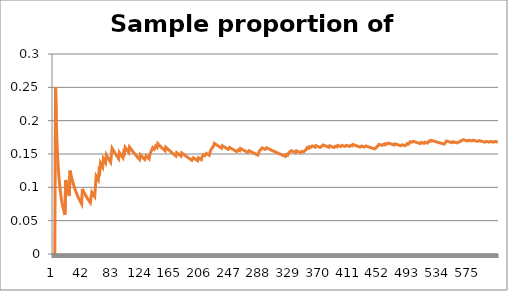
| Category | Series 1 |
|---|---|
| 0 | 0 |
| 1 | 0 |
| 2 | 0 |
| 3 | 0.25 |
| 4 | 0.2 |
| 5 | 0.167 |
| 6 | 0.143 |
| 7 | 0.125 |
| 8 | 0.111 |
| 9 | 0.1 |
| 10 | 0.091 |
| 11 | 0.083 |
| 12 | 0.077 |
| 13 | 0.071 |
| 14 | 0.067 |
| 15 | 0.062 |
| 16 | 0.059 |
| 17 | 0.111 |
| 18 | 0.105 |
| 19 | 0.1 |
| 20 | 0.095 |
| 21 | 0.091 |
| 22 | 0.087 |
| 23 | 0.125 |
| 24 | 0.12 |
| 25 | 0.115 |
| 26 | 0.111 |
| 27 | 0.107 |
| 28 | 0.103 |
| 29 | 0.1 |
| 30 | 0.097 |
| 31 | 0.094 |
| 32 | 0.091 |
| 33 | 0.088 |
| 34 | 0.086 |
| 35 | 0.083 |
| 36 | 0.081 |
| 37 | 0.079 |
| 38 | 0.077 |
| 39 | 0.075 |
| 40 | 0.098 |
| 41 | 0.095 |
| 42 | 0.093 |
| 43 | 0.091 |
| 44 | 0.089 |
| 45 | 0.087 |
| 46 | 0.085 |
| 47 | 0.083 |
| 48 | 0.082 |
| 49 | 0.08 |
| 50 | 0.078 |
| 51 | 0.077 |
| 52 | 0.075 |
| 53 | 0.093 |
| 54 | 0.091 |
| 55 | 0.089 |
| 56 | 0.088 |
| 57 | 0.086 |
| 58 | 0.102 |
| 59 | 0.117 |
| 60 | 0.115 |
| 61 | 0.113 |
| 62 | 0.111 |
| 63 | 0.125 |
| 64 | 0.123 |
| 65 | 0.136 |
| 66 | 0.134 |
| 67 | 0.132 |
| 68 | 0.13 |
| 69 | 0.143 |
| 70 | 0.141 |
| 71 | 0.139 |
| 72 | 0.137 |
| 73 | 0.149 |
| 74 | 0.147 |
| 75 | 0.145 |
| 76 | 0.143 |
| 77 | 0.141 |
| 78 | 0.139 |
| 79 | 0.138 |
| 80 | 0.148 |
| 81 | 0.159 |
| 82 | 0.157 |
| 83 | 0.155 |
| 84 | 0.153 |
| 85 | 0.151 |
| 86 | 0.149 |
| 87 | 0.148 |
| 88 | 0.146 |
| 89 | 0.144 |
| 90 | 0.143 |
| 91 | 0.152 |
| 92 | 0.151 |
| 93 | 0.149 |
| 94 | 0.147 |
| 95 | 0.146 |
| 96 | 0.144 |
| 97 | 0.153 |
| 98 | 0.152 |
| 99 | 0.16 |
| 100 | 0.158 |
| 101 | 0.157 |
| 102 | 0.155 |
| 103 | 0.154 |
| 104 | 0.152 |
| 105 | 0.16 |
| 106 | 0.159 |
| 107 | 0.157 |
| 108 | 0.156 |
| 109 | 0.155 |
| 110 | 0.153 |
| 111 | 0.152 |
| 112 | 0.15 |
| 113 | 0.149 |
| 114 | 0.148 |
| 115 | 0.147 |
| 116 | 0.145 |
| 117 | 0.144 |
| 118 | 0.143 |
| 119 | 0.142 |
| 120 | 0.149 |
| 121 | 0.148 |
| 122 | 0.146 |
| 123 | 0.145 |
| 124 | 0.144 |
| 125 | 0.143 |
| 126 | 0.142 |
| 127 | 0.141 |
| 128 | 0.147 |
| 129 | 0.146 |
| 130 | 0.145 |
| 131 | 0.144 |
| 132 | 0.143 |
| 133 | 0.149 |
| 134 | 0.148 |
| 135 | 0.154 |
| 136 | 0.153 |
| 137 | 0.159 |
| 138 | 0.158 |
| 139 | 0.157 |
| 140 | 0.156 |
| 141 | 0.162 |
| 142 | 0.161 |
| 143 | 0.16 |
| 144 | 0.166 |
| 145 | 0.164 |
| 146 | 0.163 |
| 147 | 0.162 |
| 148 | 0.161 |
| 149 | 0.16 |
| 150 | 0.159 |
| 151 | 0.158 |
| 152 | 0.157 |
| 153 | 0.156 |
| 154 | 0.155 |
| 155 | 0.16 |
| 156 | 0.159 |
| 157 | 0.158 |
| 158 | 0.157 |
| 159 | 0.156 |
| 160 | 0.155 |
| 161 | 0.154 |
| 162 | 0.153 |
| 163 | 0.152 |
| 164 | 0.152 |
| 165 | 0.151 |
| 166 | 0.15 |
| 167 | 0.149 |
| 168 | 0.148 |
| 169 | 0.147 |
| 170 | 0.152 |
| 171 | 0.151 |
| 172 | 0.15 |
| 173 | 0.149 |
| 174 | 0.149 |
| 175 | 0.148 |
| 176 | 0.147 |
| 177 | 0.152 |
| 178 | 0.151 |
| 179 | 0.15 |
| 180 | 0.149 |
| 181 | 0.148 |
| 182 | 0.148 |
| 183 | 0.147 |
| 184 | 0.146 |
| 185 | 0.145 |
| 186 | 0.144 |
| 187 | 0.144 |
| 188 | 0.143 |
| 189 | 0.142 |
| 190 | 0.141 |
| 191 | 0.141 |
| 192 | 0.14 |
| 193 | 0.144 |
| 194 | 0.144 |
| 195 | 0.143 |
| 196 | 0.142 |
| 197 | 0.141 |
| 198 | 0.141 |
| 199 | 0.14 |
| 200 | 0.144 |
| 201 | 0.144 |
| 202 | 0.143 |
| 203 | 0.142 |
| 204 | 0.141 |
| 205 | 0.146 |
| 206 | 0.145 |
| 207 | 0.149 |
| 208 | 0.148 |
| 209 | 0.148 |
| 210 | 0.147 |
| 211 | 0.151 |
| 212 | 0.15 |
| 213 | 0.15 |
| 214 | 0.149 |
| 215 | 0.148 |
| 216 | 0.152 |
| 217 | 0.156 |
| 218 | 0.155 |
| 219 | 0.159 |
| 220 | 0.158 |
| 221 | 0.162 |
| 222 | 0.166 |
| 223 | 0.165 |
| 224 | 0.164 |
| 225 | 0.164 |
| 226 | 0.163 |
| 227 | 0.162 |
| 228 | 0.162 |
| 229 | 0.161 |
| 230 | 0.16 |
| 231 | 0.159 |
| 232 | 0.159 |
| 233 | 0.162 |
| 234 | 0.162 |
| 235 | 0.161 |
| 236 | 0.16 |
| 237 | 0.16 |
| 238 | 0.159 |
| 239 | 0.158 |
| 240 | 0.158 |
| 241 | 0.157 |
| 242 | 0.156 |
| 243 | 0.16 |
| 244 | 0.159 |
| 245 | 0.159 |
| 246 | 0.158 |
| 247 | 0.157 |
| 248 | 0.157 |
| 249 | 0.156 |
| 250 | 0.155 |
| 251 | 0.155 |
| 252 | 0.154 |
| 253 | 0.154 |
| 254 | 0.153 |
| 255 | 0.156 |
| 256 | 0.156 |
| 257 | 0.155 |
| 258 | 0.158 |
| 259 | 0.158 |
| 260 | 0.157 |
| 261 | 0.156 |
| 262 | 0.156 |
| 263 | 0.155 |
| 264 | 0.155 |
| 265 | 0.154 |
| 266 | 0.154 |
| 267 | 0.153 |
| 268 | 0.152 |
| 269 | 0.152 |
| 270 | 0.155 |
| 271 | 0.154 |
| 272 | 0.154 |
| 273 | 0.153 |
| 274 | 0.153 |
| 275 | 0.152 |
| 276 | 0.152 |
| 277 | 0.151 |
| 278 | 0.151 |
| 279 | 0.15 |
| 280 | 0.149 |
| 281 | 0.149 |
| 282 | 0.148 |
| 283 | 0.151 |
| 284 | 0.154 |
| 285 | 0.154 |
| 286 | 0.157 |
| 287 | 0.156 |
| 288 | 0.159 |
| 289 | 0.159 |
| 290 | 0.158 |
| 291 | 0.158 |
| 292 | 0.157 |
| 293 | 0.156 |
| 294 | 0.159 |
| 295 | 0.159 |
| 296 | 0.158 |
| 297 | 0.158 |
| 298 | 0.157 |
| 299 | 0.157 |
| 300 | 0.156 |
| 301 | 0.156 |
| 302 | 0.155 |
| 303 | 0.155 |
| 304 | 0.154 |
| 305 | 0.154 |
| 306 | 0.153 |
| 307 | 0.153 |
| 308 | 0.152 |
| 309 | 0.152 |
| 310 | 0.151 |
| 311 | 0.151 |
| 312 | 0.15 |
| 313 | 0.15 |
| 314 | 0.149 |
| 315 | 0.149 |
| 316 | 0.148 |
| 317 | 0.148 |
| 318 | 0.147 |
| 319 | 0.147 |
| 320 | 0.146 |
| 321 | 0.149 |
| 322 | 0.149 |
| 323 | 0.148 |
| 324 | 0.151 |
| 325 | 0.15 |
| 326 | 0.153 |
| 327 | 0.152 |
| 328 | 0.155 |
| 329 | 0.155 |
| 330 | 0.154 |
| 331 | 0.154 |
| 332 | 0.153 |
| 333 | 0.153 |
| 334 | 0.152 |
| 335 | 0.155 |
| 336 | 0.154 |
| 337 | 0.154 |
| 338 | 0.153 |
| 339 | 0.153 |
| 340 | 0.152 |
| 341 | 0.152 |
| 342 | 0.152 |
| 343 | 0.154 |
| 344 | 0.154 |
| 345 | 0.153 |
| 346 | 0.153 |
| 347 | 0.155 |
| 348 | 0.155 |
| 349 | 0.157 |
| 350 | 0.16 |
| 351 | 0.159 |
| 352 | 0.159 |
| 353 | 0.161 |
| 354 | 0.161 |
| 355 | 0.16 |
| 356 | 0.16 |
| 357 | 0.162 |
| 358 | 0.162 |
| 359 | 0.161 |
| 360 | 0.161 |
| 361 | 0.16 |
| 362 | 0.163 |
| 363 | 0.162 |
| 364 | 0.162 |
| 365 | 0.161 |
| 366 | 0.161 |
| 367 | 0.16 |
| 368 | 0.16 |
| 369 | 0.159 |
| 370 | 0.162 |
| 371 | 0.161 |
| 372 | 0.164 |
| 373 | 0.163 |
| 374 | 0.163 |
| 375 | 0.162 |
| 376 | 0.162 |
| 377 | 0.161 |
| 378 | 0.161 |
| 379 | 0.161 |
| 380 | 0.16 |
| 381 | 0.162 |
| 382 | 0.162 |
| 383 | 0.161 |
| 384 | 0.161 |
| 385 | 0.161 |
| 386 | 0.16 |
| 387 | 0.16 |
| 388 | 0.159 |
| 389 | 0.162 |
| 390 | 0.161 |
| 391 | 0.161 |
| 392 | 0.163 |
| 393 | 0.162 |
| 394 | 0.162 |
| 395 | 0.162 |
| 396 | 0.161 |
| 397 | 0.161 |
| 398 | 0.163 |
| 399 | 0.162 |
| 400 | 0.162 |
| 401 | 0.162 |
| 402 | 0.161 |
| 403 | 0.161 |
| 404 | 0.163 |
| 405 | 0.163 |
| 406 | 0.162 |
| 407 | 0.162 |
| 408 | 0.161 |
| 409 | 0.161 |
| 410 | 0.163 |
| 411 | 0.163 |
| 412 | 0.162 |
| 413 | 0.164 |
| 414 | 0.164 |
| 415 | 0.163 |
| 416 | 0.163 |
| 417 | 0.163 |
| 418 | 0.162 |
| 419 | 0.162 |
| 420 | 0.162 |
| 421 | 0.161 |
| 422 | 0.161 |
| 423 | 0.16 |
| 424 | 0.16 |
| 425 | 0.162 |
| 426 | 0.162 |
| 427 | 0.161 |
| 428 | 0.161 |
| 429 | 0.16 |
| 430 | 0.16 |
| 431 | 0.162 |
| 432 | 0.162 |
| 433 | 0.161 |
| 434 | 0.161 |
| 435 | 0.161 |
| 436 | 0.16 |
| 437 | 0.16 |
| 438 | 0.159 |
| 439 | 0.159 |
| 440 | 0.159 |
| 441 | 0.158 |
| 442 | 0.158 |
| 443 | 0.158 |
| 444 | 0.157 |
| 445 | 0.159 |
| 446 | 0.161 |
| 447 | 0.161 |
| 448 | 0.163 |
| 449 | 0.164 |
| 450 | 0.164 |
| 451 | 0.164 |
| 452 | 0.163 |
| 453 | 0.163 |
| 454 | 0.163 |
| 455 | 0.164 |
| 456 | 0.164 |
| 457 | 0.164 |
| 458 | 0.166 |
| 459 | 0.165 |
| 460 | 0.165 |
| 461 | 0.165 |
| 462 | 0.166 |
| 463 | 0.166 |
| 464 | 0.166 |
| 465 | 0.165 |
| 466 | 0.165 |
| 467 | 0.165 |
| 468 | 0.164 |
| 469 | 0.164 |
| 470 | 0.163 |
| 471 | 0.165 |
| 472 | 0.165 |
| 473 | 0.165 |
| 474 | 0.164 |
| 475 | 0.164 |
| 476 | 0.164 |
| 477 | 0.163 |
| 478 | 0.163 |
| 479 | 0.162 |
| 480 | 0.162 |
| 481 | 0.164 |
| 482 | 0.164 |
| 483 | 0.163 |
| 484 | 0.163 |
| 485 | 0.163 |
| 486 | 0.162 |
| 487 | 0.164 |
| 488 | 0.166 |
| 489 | 0.165 |
| 490 | 0.165 |
| 491 | 0.167 |
| 492 | 0.168 |
| 493 | 0.168 |
| 494 | 0.168 |
| 495 | 0.167 |
| 496 | 0.169 |
| 497 | 0.169 |
| 498 | 0.168 |
| 499 | 0.168 |
| 500 | 0.168 |
| 501 | 0.167 |
| 502 | 0.167 |
| 503 | 0.167 |
| 504 | 0.166 |
| 505 | 0.166 |
| 506 | 0.166 |
| 507 | 0.167 |
| 508 | 0.167 |
| 509 | 0.167 |
| 510 | 0.166 |
| 511 | 0.166 |
| 512 | 0.168 |
| 513 | 0.167 |
| 514 | 0.167 |
| 515 | 0.167 |
| 516 | 0.166 |
| 517 | 0.168 |
| 518 | 0.17 |
| 519 | 0.169 |
| 520 | 0.169 |
| 521 | 0.17 |
| 522 | 0.17 |
| 523 | 0.17 |
| 524 | 0.17 |
| 525 | 0.169 |
| 526 | 0.169 |
| 527 | 0.169 |
| 528 | 0.168 |
| 529 | 0.168 |
| 530 | 0.168 |
| 531 | 0.167 |
| 532 | 0.167 |
| 533 | 0.167 |
| 534 | 0.166 |
| 535 | 0.166 |
| 536 | 0.166 |
| 537 | 0.165 |
| 538 | 0.165 |
| 539 | 0.165 |
| 540 | 0.166 |
| 541 | 0.168 |
| 542 | 0.169 |
| 543 | 0.169 |
| 544 | 0.169 |
| 545 | 0.168 |
| 546 | 0.168 |
| 547 | 0.168 |
| 548 | 0.168 |
| 549 | 0.167 |
| 550 | 0.167 |
| 551 | 0.168 |
| 552 | 0.168 |
| 553 | 0.168 |
| 554 | 0.168 |
| 555 | 0.167 |
| 556 | 0.167 |
| 557 | 0.167 |
| 558 | 0.168 |
| 559 | 0.168 |
| 560 | 0.168 |
| 561 | 0.169 |
| 562 | 0.171 |
| 563 | 0.17 |
| 564 | 0.172 |
| 565 | 0.171 |
| 566 | 0.171 |
| 567 | 0.171 |
| 568 | 0.17 |
| 569 | 0.17 |
| 570 | 0.17 |
| 571 | 0.17 |
| 572 | 0.169 |
| 573 | 0.171 |
| 574 | 0.17 |
| 575 | 0.17 |
| 576 | 0.17 |
| 577 | 0.17 |
| 578 | 0.171 |
| 579 | 0.171 |
| 580 | 0.17 |
| 581 | 0.17 |
| 582 | 0.17 |
| 583 | 0.17 |
| 584 | 0.169 |
| 585 | 0.169 |
| 586 | 0.17 |
| 587 | 0.17 |
| 588 | 0.17 |
| 589 | 0.169 |
| 590 | 0.169 |
| 591 | 0.169 |
| 592 | 0.169 |
| 593 | 0.168 |
| 594 | 0.168 |
| 595 | 0.168 |
| 596 | 0.169 |
| 597 | 0.169 |
| 598 | 0.169 |
| 599 | 0.168 |
| 600 | 0.168 |
| 601 | 0.168 |
| 602 | 0.169 |
| 603 | 0.169 |
| 604 | 0.169 |
| 605 | 0.168 |
| 606 | 0.168 |
| 607 | 0.168 |
| 608 | 0.169 |
| 609 | 0.169 |
| 610 | 0.169 |
| 611 | 0.168 |
| 612 | 0.168 |
| 613 | 0.168 |
| 614 | 0.167 |